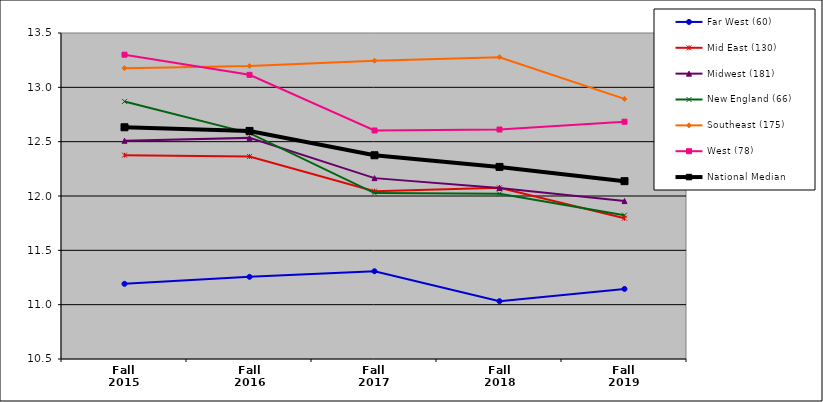
| Category | Far West (60) | Mid East (130) | Midwest (181) | New England (66) | Southeast (175) | West (78) | National Median |
|---|---|---|---|---|---|---|---|
| Fall 2015 | 11.192 | 12.376 | 12.508 | 12.87 | 13.176 | 13.3 | 12.633 |
| Fall 2016 | 11.256 | 12.364 | 12.535 | 12.578 | 13.196 | 13.115 | 12.599 |
| Fall 2017 | 11.308 | 12.044 | 12.164 | 12.027 | 13.245 | 12.603 | 12.375 |
| Fall 2018 | 11.032 | 12.075 | 12.074 | 12.02 | 13.277 | 12.612 | 12.268 |
| Fall 2019 | 11.145 | 11.796 | 11.953 | 11.823 | 12.893 | 12.684 | 12.137 |